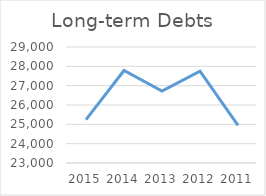
| Category | Long-term Debts |
|---|---|
| 2015.0 | 25247 |
| 2014.0 | 27784 |
| 2013.0 | 26719 |
| 2012.0 | 27752 |
| 2011.0 | 24944 |